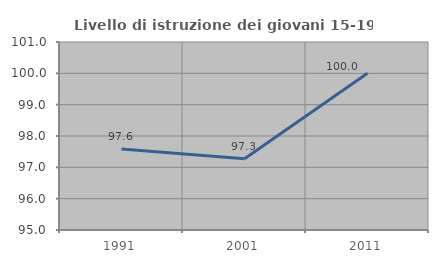
| Category | Livello di istruzione dei giovani 15-19 anni |
|---|---|
| 1991.0 | 97.587 |
| 2001.0 | 97.276 |
| 2011.0 | 100 |